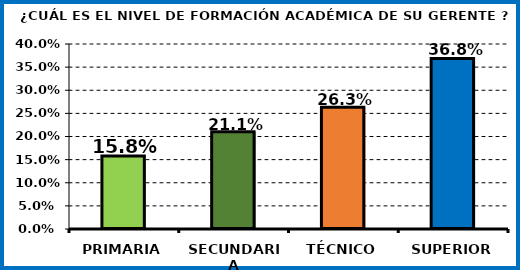
| Category | Series 0 |
|---|---|
| PRIMARIA | 0.158 |
| SECUNDARIA | 0.211 |
| TÉCNICO | 0.263 |
| SUPERIOR | 0.368 |